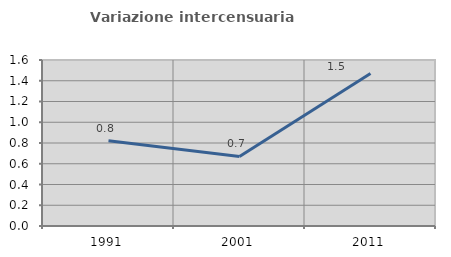
| Category | Variazione intercensuaria annua |
|---|---|
| 1991.0 | 0.822 |
| 2001.0 | 0.67 |
| 2011.0 | 1.469 |